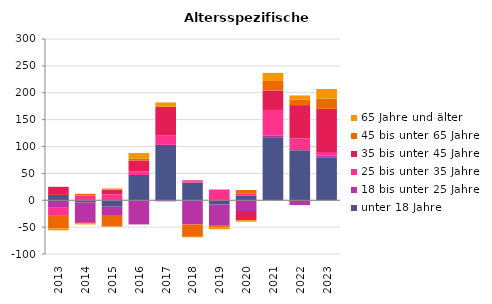
| Category | unter 18 Jahre | 18 bis unter 25 Jahre | 25 bis unter 35 Jahre | 35 bis unter 45 Jahre | 45 bis unter 65 Jahre | 65 Jahre und älter |
|---|---|---|---|---|---|---|
| 2013.0 | 10 | -14 | -15 | 15 | -23 | -4 |
| 2014.0 | -4 | -37 | 9 | -2 | 3 | -2 |
| 2015.0 | -12 | -17 | 11 | 8 | -20 | 3 |
| 2016.0 | 47 | -45 | 7 | 20 | 3 | 11 |
| 2017.0 | 103 | -2 | 18 | 53 | 0 | 8 |
| 2018.0 | 33 | -45 | 2 | 2 | -23 | -1 |
| 2019.0 | -8 | -39 | 20 | -1 | -3 | -3 |
| 2020.0 | 9 | -20 | 4 | -17 | 6 | -3 |
| 2021.0 | 117 | 3 | 48 | 36 | 18 | 15 |
| 2022.0 | 93 | -9 | 22 | 62 | 10 | 8 |
| 2023.0 | 79 | 4 | 7 | 80 | 19 | 18 |